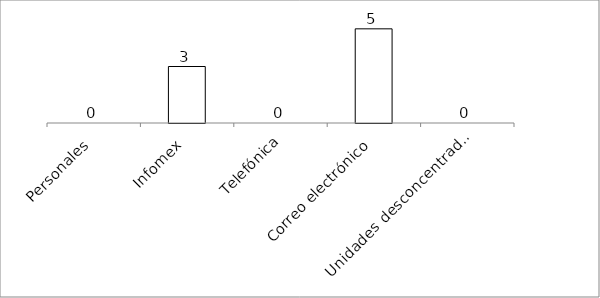
| Category | Series 0 |
|---|---|
| Personales | 0 |
| Infomex | 3 |
| Telefónica | 0 |
| Correo electrónico | 5 |
| Unidades desconcentradas | 0 |